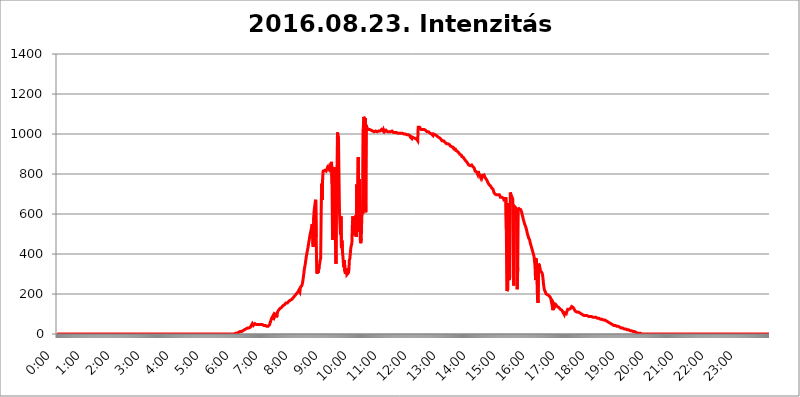
| Category | 2016.08.23. Intenzitás [W/m^2] |
|---|---|
| 0.0 | 0 |
| 0.0006944444444444445 | 0 |
| 0.001388888888888889 | 0 |
| 0.0020833333333333333 | 0 |
| 0.002777777777777778 | 0 |
| 0.003472222222222222 | 0 |
| 0.004166666666666667 | 0 |
| 0.004861111111111111 | 0 |
| 0.005555555555555556 | 0 |
| 0.0062499999999999995 | 0 |
| 0.006944444444444444 | 0 |
| 0.007638888888888889 | 0 |
| 0.008333333333333333 | 0 |
| 0.009027777777777779 | 0 |
| 0.009722222222222222 | 0 |
| 0.010416666666666666 | 0 |
| 0.011111111111111112 | 0 |
| 0.011805555555555555 | 0 |
| 0.012499999999999999 | 0 |
| 0.013194444444444444 | 0 |
| 0.013888888888888888 | 0 |
| 0.014583333333333332 | 0 |
| 0.015277777777777777 | 0 |
| 0.015972222222222224 | 0 |
| 0.016666666666666666 | 0 |
| 0.017361111111111112 | 0 |
| 0.018055555555555557 | 0 |
| 0.01875 | 0 |
| 0.019444444444444445 | 0 |
| 0.02013888888888889 | 0 |
| 0.020833333333333332 | 0 |
| 0.02152777777777778 | 0 |
| 0.022222222222222223 | 0 |
| 0.02291666666666667 | 0 |
| 0.02361111111111111 | 0 |
| 0.024305555555555556 | 0 |
| 0.024999999999999998 | 0 |
| 0.025694444444444447 | 0 |
| 0.02638888888888889 | 0 |
| 0.027083333333333334 | 0 |
| 0.027777777777777776 | 0 |
| 0.02847222222222222 | 0 |
| 0.029166666666666664 | 0 |
| 0.029861111111111113 | 0 |
| 0.030555555555555555 | 0 |
| 0.03125 | 0 |
| 0.03194444444444445 | 0 |
| 0.03263888888888889 | 0 |
| 0.03333333333333333 | 0 |
| 0.034027777777777775 | 0 |
| 0.034722222222222224 | 0 |
| 0.035416666666666666 | 0 |
| 0.036111111111111115 | 0 |
| 0.03680555555555556 | 0 |
| 0.0375 | 0 |
| 0.03819444444444444 | 0 |
| 0.03888888888888889 | 0 |
| 0.03958333333333333 | 0 |
| 0.04027777777777778 | 0 |
| 0.04097222222222222 | 0 |
| 0.041666666666666664 | 0 |
| 0.042361111111111106 | 0 |
| 0.04305555555555556 | 0 |
| 0.043750000000000004 | 0 |
| 0.044444444444444446 | 0 |
| 0.04513888888888889 | 0 |
| 0.04583333333333334 | 0 |
| 0.04652777777777778 | 0 |
| 0.04722222222222222 | 0 |
| 0.04791666666666666 | 0 |
| 0.04861111111111111 | 0 |
| 0.049305555555555554 | 0 |
| 0.049999999999999996 | 0 |
| 0.05069444444444445 | 0 |
| 0.051388888888888894 | 0 |
| 0.052083333333333336 | 0 |
| 0.05277777777777778 | 0 |
| 0.05347222222222222 | 0 |
| 0.05416666666666667 | 0 |
| 0.05486111111111111 | 0 |
| 0.05555555555555555 | 0 |
| 0.05625 | 0 |
| 0.05694444444444444 | 0 |
| 0.057638888888888885 | 0 |
| 0.05833333333333333 | 0 |
| 0.05902777777777778 | 0 |
| 0.059722222222222225 | 0 |
| 0.06041666666666667 | 0 |
| 0.061111111111111116 | 0 |
| 0.06180555555555556 | 0 |
| 0.0625 | 0 |
| 0.06319444444444444 | 0 |
| 0.06388888888888888 | 0 |
| 0.06458333333333334 | 0 |
| 0.06527777777777778 | 0 |
| 0.06597222222222222 | 0 |
| 0.06666666666666667 | 0 |
| 0.06736111111111111 | 0 |
| 0.06805555555555555 | 0 |
| 0.06874999999999999 | 0 |
| 0.06944444444444443 | 0 |
| 0.07013888888888889 | 0 |
| 0.07083333333333333 | 0 |
| 0.07152777777777779 | 0 |
| 0.07222222222222223 | 0 |
| 0.07291666666666667 | 0 |
| 0.07361111111111111 | 0 |
| 0.07430555555555556 | 0 |
| 0.075 | 0 |
| 0.07569444444444444 | 0 |
| 0.0763888888888889 | 0 |
| 0.07708333333333334 | 0 |
| 0.07777777777777778 | 0 |
| 0.07847222222222222 | 0 |
| 0.07916666666666666 | 0 |
| 0.0798611111111111 | 0 |
| 0.08055555555555556 | 0 |
| 0.08125 | 0 |
| 0.08194444444444444 | 0 |
| 0.08263888888888889 | 0 |
| 0.08333333333333333 | 0 |
| 0.08402777777777777 | 0 |
| 0.08472222222222221 | 0 |
| 0.08541666666666665 | 0 |
| 0.08611111111111112 | 0 |
| 0.08680555555555557 | 0 |
| 0.08750000000000001 | 0 |
| 0.08819444444444445 | 0 |
| 0.08888888888888889 | 0 |
| 0.08958333333333333 | 0 |
| 0.09027777777777778 | 0 |
| 0.09097222222222222 | 0 |
| 0.09166666666666667 | 0 |
| 0.09236111111111112 | 0 |
| 0.09305555555555556 | 0 |
| 0.09375 | 0 |
| 0.09444444444444444 | 0 |
| 0.09513888888888888 | 0 |
| 0.09583333333333333 | 0 |
| 0.09652777777777777 | 0 |
| 0.09722222222222222 | 0 |
| 0.09791666666666667 | 0 |
| 0.09861111111111111 | 0 |
| 0.09930555555555555 | 0 |
| 0.09999999999999999 | 0 |
| 0.10069444444444443 | 0 |
| 0.1013888888888889 | 0 |
| 0.10208333333333335 | 0 |
| 0.10277777777777779 | 0 |
| 0.10347222222222223 | 0 |
| 0.10416666666666667 | 0 |
| 0.10486111111111111 | 0 |
| 0.10555555555555556 | 0 |
| 0.10625 | 0 |
| 0.10694444444444444 | 0 |
| 0.1076388888888889 | 0 |
| 0.10833333333333334 | 0 |
| 0.10902777777777778 | 0 |
| 0.10972222222222222 | 0 |
| 0.1111111111111111 | 0 |
| 0.11180555555555556 | 0 |
| 0.11180555555555556 | 0 |
| 0.1125 | 0 |
| 0.11319444444444444 | 0 |
| 0.11388888888888889 | 0 |
| 0.11458333333333333 | 0 |
| 0.11527777777777777 | 0 |
| 0.11597222222222221 | 0 |
| 0.11666666666666665 | 0 |
| 0.1173611111111111 | 0 |
| 0.11805555555555557 | 0 |
| 0.11944444444444445 | 0 |
| 0.12013888888888889 | 0 |
| 0.12083333333333333 | 0 |
| 0.12152777777777778 | 0 |
| 0.12222222222222223 | 0 |
| 0.12291666666666667 | 0 |
| 0.12291666666666667 | 0 |
| 0.12361111111111112 | 0 |
| 0.12430555555555556 | 0 |
| 0.125 | 0 |
| 0.12569444444444444 | 0 |
| 0.12638888888888888 | 0 |
| 0.12708333333333333 | 0 |
| 0.16875 | 0 |
| 0.12847222222222224 | 0 |
| 0.12916666666666668 | 0 |
| 0.12986111111111112 | 0 |
| 0.13055555555555556 | 0 |
| 0.13125 | 0 |
| 0.13194444444444445 | 0 |
| 0.1326388888888889 | 0 |
| 0.13333333333333333 | 0 |
| 0.13402777777777777 | 0 |
| 0.13402777777777777 | 0 |
| 0.13472222222222222 | 0 |
| 0.13541666666666666 | 0 |
| 0.1361111111111111 | 0 |
| 0.13749999999999998 | 0 |
| 0.13819444444444443 | 0 |
| 0.1388888888888889 | 0 |
| 0.13958333333333334 | 0 |
| 0.14027777777777778 | 0 |
| 0.14097222222222222 | 0 |
| 0.14166666666666666 | 0 |
| 0.1423611111111111 | 0 |
| 0.14305555555555557 | 0 |
| 0.14375000000000002 | 0 |
| 0.14444444444444446 | 0 |
| 0.1451388888888889 | 0 |
| 0.1451388888888889 | 0 |
| 0.14652777777777778 | 0 |
| 0.14722222222222223 | 0 |
| 0.14791666666666667 | 0 |
| 0.1486111111111111 | 0 |
| 0.14930555555555555 | 0 |
| 0.15 | 0 |
| 0.15069444444444444 | 0 |
| 0.15138888888888888 | 0 |
| 0.15208333333333332 | 0 |
| 0.15277777777777776 | 0 |
| 0.15347222222222223 | 0 |
| 0.15416666666666667 | 0 |
| 0.15486111111111112 | 0 |
| 0.15555555555555556 | 0 |
| 0.15625 | 0 |
| 0.15694444444444444 | 0 |
| 0.15763888888888888 | 0 |
| 0.15833333333333333 | 0 |
| 0.15902777777777777 | 0 |
| 0.15972222222222224 | 0 |
| 0.16041666666666668 | 0 |
| 0.16111111111111112 | 0 |
| 0.16180555555555556 | 0 |
| 0.1625 | 0 |
| 0.16319444444444445 | 0 |
| 0.1638888888888889 | 0 |
| 0.16458333333333333 | 0 |
| 0.16527777777777777 | 0 |
| 0.16597222222222222 | 0 |
| 0.16666666666666666 | 0 |
| 0.1673611111111111 | 0 |
| 0.16805555555555554 | 0 |
| 0.16874999999999998 | 0 |
| 0.16944444444444443 | 0 |
| 0.17013888888888887 | 0 |
| 0.1708333333333333 | 0 |
| 0.17152777777777775 | 0 |
| 0.17222222222222225 | 0 |
| 0.1729166666666667 | 0 |
| 0.17361111111111113 | 0 |
| 0.17430555555555557 | 0 |
| 0.17500000000000002 | 0 |
| 0.17569444444444446 | 0 |
| 0.1763888888888889 | 0 |
| 0.17708333333333334 | 0 |
| 0.17777777777777778 | 0 |
| 0.17847222222222223 | 0 |
| 0.17916666666666667 | 0 |
| 0.1798611111111111 | 0 |
| 0.18055555555555555 | 0 |
| 0.18125 | 0 |
| 0.18194444444444444 | 0 |
| 0.1826388888888889 | 0 |
| 0.18333333333333335 | 0 |
| 0.1840277777777778 | 0 |
| 0.18472222222222223 | 0 |
| 0.18541666666666667 | 0 |
| 0.18611111111111112 | 0 |
| 0.18680555555555556 | 0 |
| 0.1875 | 0 |
| 0.18819444444444444 | 0 |
| 0.18888888888888888 | 0 |
| 0.18958333333333333 | 0 |
| 0.19027777777777777 | 0 |
| 0.1909722222222222 | 0 |
| 0.19166666666666665 | 0 |
| 0.19236111111111112 | 0 |
| 0.19305555555555554 | 0 |
| 0.19375 | 0 |
| 0.19444444444444445 | 0 |
| 0.1951388888888889 | 0 |
| 0.19583333333333333 | 0 |
| 0.19652777777777777 | 0 |
| 0.19722222222222222 | 0 |
| 0.19791666666666666 | 0 |
| 0.1986111111111111 | 0 |
| 0.19930555555555554 | 0 |
| 0.19999999999999998 | 0 |
| 0.20069444444444443 | 0 |
| 0.20138888888888887 | 0 |
| 0.2020833333333333 | 0 |
| 0.2027777777777778 | 0 |
| 0.2034722222222222 | 0 |
| 0.2041666666666667 | 0 |
| 0.20486111111111113 | 0 |
| 0.20555555555555557 | 0 |
| 0.20625000000000002 | 0 |
| 0.20694444444444446 | 0 |
| 0.2076388888888889 | 0 |
| 0.20833333333333334 | 0 |
| 0.20902777777777778 | 0 |
| 0.20972222222222223 | 0 |
| 0.21041666666666667 | 0 |
| 0.2111111111111111 | 0 |
| 0.21180555555555555 | 0 |
| 0.2125 | 0 |
| 0.21319444444444444 | 0 |
| 0.2138888888888889 | 0 |
| 0.21458333333333335 | 0 |
| 0.2152777777777778 | 0 |
| 0.21597222222222223 | 0 |
| 0.21666666666666667 | 0 |
| 0.21736111111111112 | 0 |
| 0.21805555555555556 | 0 |
| 0.21875 | 0 |
| 0.21944444444444444 | 0 |
| 0.22013888888888888 | 0 |
| 0.22083333333333333 | 0 |
| 0.22152777777777777 | 0 |
| 0.2222222222222222 | 0 |
| 0.22291666666666665 | 0 |
| 0.2236111111111111 | 0 |
| 0.22430555555555556 | 0 |
| 0.225 | 0 |
| 0.22569444444444445 | 0 |
| 0.2263888888888889 | 0 |
| 0.22708333333333333 | 0 |
| 0.22777777777777777 | 0 |
| 0.22847222222222222 | 0 |
| 0.22916666666666666 | 0 |
| 0.2298611111111111 | 0 |
| 0.23055555555555554 | 0 |
| 0.23124999999999998 | 0 |
| 0.23194444444444443 | 0 |
| 0.23263888888888887 | 0 |
| 0.2333333333333333 | 0 |
| 0.2340277777777778 | 0 |
| 0.2347222222222222 | 0 |
| 0.2354166666666667 | 0 |
| 0.23611111111111113 | 0 |
| 0.23680555555555557 | 0 |
| 0.23750000000000002 | 0 |
| 0.23819444444444446 | 0 |
| 0.2388888888888889 | 0 |
| 0.23958333333333334 | 0 |
| 0.24027777777777778 | 0 |
| 0.24097222222222223 | 0 |
| 0.24166666666666667 | 0 |
| 0.2423611111111111 | 0 |
| 0.24305555555555555 | 0 |
| 0.24375 | 0 |
| 0.24444444444444446 | 0 |
| 0.24513888888888888 | 0 |
| 0.24583333333333335 | 0 |
| 0.2465277777777778 | 0 |
| 0.24722222222222223 | 0 |
| 0.24791666666666667 | 0 |
| 0.24861111111111112 | 0 |
| 0.24930555555555556 | 0 |
| 0.25 | 3.525 |
| 0.25069444444444444 | 3.525 |
| 0.2513888888888889 | 3.525 |
| 0.2520833333333333 | 3.525 |
| 0.25277777777777777 | 3.525 |
| 0.2534722222222222 | 7.887 |
| 0.25416666666666665 | 7.887 |
| 0.2548611111111111 | 7.887 |
| 0.2555555555555556 | 12.257 |
| 0.25625000000000003 | 12.257 |
| 0.2569444444444445 | 12.257 |
| 0.2576388888888889 | 12.257 |
| 0.25833333333333336 | 12.257 |
| 0.2590277777777778 | 12.257 |
| 0.25972222222222224 | 16.636 |
| 0.2604166666666667 | 16.636 |
| 0.2611111111111111 | 21.024 |
| 0.26180555555555557 | 21.024 |
| 0.2625 | 21.024 |
| 0.26319444444444445 | 25.419 |
| 0.2638888888888889 | 25.419 |
| 0.26458333333333334 | 25.419 |
| 0.2652777777777778 | 29.823 |
| 0.2659722222222222 | 29.823 |
| 0.26666666666666666 | 29.823 |
| 0.2673611111111111 | 29.823 |
| 0.26805555555555555 | 29.823 |
| 0.26875 | 29.823 |
| 0.26944444444444443 | 29.823 |
| 0.2701388888888889 | 29.823 |
| 0.2708333333333333 | 34.234 |
| 0.27152777777777776 | 38.653 |
| 0.2722222222222222 | 43.079 |
| 0.27291666666666664 | 47.511 |
| 0.2736111111111111 | 51.951 |
| 0.2743055555555555 | 47.511 |
| 0.27499999999999997 | 43.079 |
| 0.27569444444444446 | 43.079 |
| 0.27638888888888885 | 43.079 |
| 0.27708333333333335 | 51.951 |
| 0.2777777777777778 | 56.398 |
| 0.27847222222222223 | 51.951 |
| 0.2791666666666667 | 47.511 |
| 0.2798611111111111 | 47.511 |
| 0.28055555555555556 | 47.511 |
| 0.28125 | 47.511 |
| 0.28194444444444444 | 47.511 |
| 0.2826388888888889 | 47.511 |
| 0.2833333333333333 | 47.511 |
| 0.28402777777777777 | 47.511 |
| 0.2847222222222222 | 47.511 |
| 0.28541666666666665 | 47.511 |
| 0.28611111111111115 | 47.511 |
| 0.28680555555555554 | 47.511 |
| 0.28750000000000003 | 47.511 |
| 0.2881944444444445 | 43.079 |
| 0.2888888888888889 | 43.079 |
| 0.28958333333333336 | 43.079 |
| 0.2902777777777778 | 43.079 |
| 0.29097222222222224 | 43.079 |
| 0.2916666666666667 | 43.079 |
| 0.2923611111111111 | 43.079 |
| 0.29305555555555557 | 43.079 |
| 0.29375 | 38.653 |
| 0.29444444444444445 | 38.653 |
| 0.2951388888888889 | 38.653 |
| 0.29583333333333334 | 38.653 |
| 0.2965277777777778 | 43.079 |
| 0.2972222222222222 | 43.079 |
| 0.29791666666666666 | 47.511 |
| 0.2986111111111111 | 56.398 |
| 0.29930555555555555 | 60.85 |
| 0.3 | 56.398 |
| 0.30069444444444443 | 78.722 |
| 0.3013888888888889 | 83.205 |
| 0.3020833333333333 | 87.692 |
| 0.30277777777777776 | 69.775 |
| 0.3034722222222222 | 65.31 |
| 0.30416666666666664 | 83.205 |
| 0.3048611111111111 | 101.184 |
| 0.3055555555555555 | 105.69 |
| 0.30624999999999997 | 105.69 |
| 0.3069444444444444 | 96.682 |
| 0.3076388888888889 | 83.205 |
| 0.30833333333333335 | 96.682 |
| 0.3090277777777778 | 110.201 |
| 0.30972222222222223 | 114.716 |
| 0.3104166666666667 | 119.235 |
| 0.3111111111111111 | 123.758 |
| 0.31180555555555556 | 123.758 |
| 0.3125 | 128.284 |
| 0.31319444444444444 | 128.284 |
| 0.3138888888888889 | 132.814 |
| 0.3145833333333333 | 132.814 |
| 0.31527777777777777 | 137.347 |
| 0.3159722222222222 | 137.347 |
| 0.31666666666666665 | 141.884 |
| 0.31736111111111115 | 141.884 |
| 0.31805555555555554 | 146.423 |
| 0.31875000000000003 | 146.423 |
| 0.3194444444444445 | 150.964 |
| 0.3201388888888889 | 150.964 |
| 0.32083333333333336 | 155.509 |
| 0.3215277777777778 | 155.509 |
| 0.32222222222222224 | 155.509 |
| 0.3229166666666667 | 155.509 |
| 0.3236111111111111 | 160.056 |
| 0.32430555555555557 | 160.056 |
| 0.325 | 164.605 |
| 0.32569444444444445 | 164.605 |
| 0.3263888888888889 | 164.605 |
| 0.32708333333333334 | 169.156 |
| 0.3277777777777778 | 169.156 |
| 0.3284722222222222 | 173.709 |
| 0.32916666666666666 | 173.709 |
| 0.3298611111111111 | 178.264 |
| 0.33055555555555555 | 178.264 |
| 0.33125 | 182.82 |
| 0.33194444444444443 | 182.82 |
| 0.3326388888888889 | 187.378 |
| 0.3333333333333333 | 191.937 |
| 0.3340277777777778 | 191.937 |
| 0.3347222222222222 | 196.497 |
| 0.3354166666666667 | 201.058 |
| 0.3361111111111111 | 205.62 |
| 0.3368055555555556 | 205.62 |
| 0.33749999999999997 | 210.182 |
| 0.33819444444444446 | 214.746 |
| 0.33888888888888885 | 219.309 |
| 0.33958333333333335 | 219.309 |
| 0.34027777777777773 | 210.182 |
| 0.34097222222222223 | 233 |
| 0.3416666666666666 | 233 |
| 0.3423611111111111 | 237.564 |
| 0.3430555555555555 | 242.127 |
| 0.34375 | 251.251 |
| 0.3444444444444445 | 264.932 |
| 0.3451388888888889 | 283.156 |
| 0.3458333333333334 | 301.354 |
| 0.34652777777777777 | 324.052 |
| 0.34722222222222227 | 337.639 |
| 0.34791666666666665 | 351.198 |
| 0.34861111111111115 | 369.23 |
| 0.34930555555555554 | 387.202 |
| 0.35000000000000003 | 400.638 |
| 0.3506944444444444 | 414.035 |
| 0.3513888888888889 | 427.39 |
| 0.3520833333333333 | 440.702 |
| 0.3527777777777778 | 458.38 |
| 0.3534722222222222 | 471.582 |
| 0.3541666666666667 | 489.108 |
| 0.3548611111111111 | 502.192 |
| 0.35555555555555557 | 506.542 |
| 0.35625 | 523.88 |
| 0.35694444444444445 | 523.88 |
| 0.3576388888888889 | 549.704 |
| 0.35833333333333334 | 549.704 |
| 0.3590277777777778 | 436.27 |
| 0.3597222222222222 | 583.779 |
| 0.36041666666666666 | 621.613 |
| 0.3611111111111111 | 638.256 |
| 0.36180555555555555 | 658.909 |
| 0.3625 | 671.22 |
| 0.36319444444444443 | 484.735 |
| 0.3638888888888889 | 310.44 |
| 0.3645833333333333 | 301.354 |
| 0.3652777777777778 | 324.052 |
| 0.3659722222222222 | 305.898 |
| 0.3666666666666667 | 305.898 |
| 0.3673611111111111 | 337.639 |
| 0.3680555555555556 | 351.198 |
| 0.36874999999999997 | 369.23 |
| 0.36944444444444446 | 378.224 |
| 0.37013888888888885 | 596.45 |
| 0.37083333333333335 | 751.803 |
| 0.37152777777777773 | 671.22 |
| 0.37222222222222223 | 775.492 |
| 0.3729166666666666 | 814.519 |
| 0.3736111111111111 | 814.519 |
| 0.3743055555555555 | 818.392 |
| 0.375 | 818.392 |
| 0.3756944444444445 | 818.392 |
| 0.3763888888888889 | 814.519 |
| 0.3770833333333334 | 814.519 |
| 0.37777777777777777 | 822.26 |
| 0.37847222222222227 | 826.123 |
| 0.37916666666666665 | 833.834 |
| 0.37986111111111115 | 829.981 |
| 0.38055555555555554 | 826.123 |
| 0.38125000000000003 | 833.834 |
| 0.3819444444444444 | 826.123 |
| 0.3826388888888889 | 826.123 |
| 0.3833333333333333 | 837.682 |
| 0.3840277777777778 | 849.199 |
| 0.3847222222222222 | 860.676 |
| 0.3854166666666667 | 751.803 |
| 0.3861111111111111 | 471.582 |
| 0.38680555555555557 | 683.473 |
| 0.3875 | 566.793 |
| 0.38819444444444445 | 833.834 |
| 0.3888888888888889 | 549.704 |
| 0.38958333333333334 | 779.42 |
| 0.3902777777777778 | 436.27 |
| 0.3909722222222222 | 351.198 |
| 0.39166666666666666 | 822.26 |
| 0.3923611111111111 | 625.784 |
| 0.39305555555555555 | 1007.383 |
| 0.39375 | 992.448 |
| 0.39444444444444443 | 984.98 |
| 0.3951388888888889 | 984.98 |
| 0.3958333333333333 | 609.062 |
| 0.3965277777777778 | 609.062 |
| 0.3972222222222222 | 497.836 |
| 0.3979166666666667 | 588.009 |
| 0.3986111111111111 | 431.833 |
| 0.3993055555555556 | 467.187 |
| 0.39999999999999997 | 414.035 |
| 0.40069444444444446 | 387.202 |
| 0.40138888888888885 | 351.198 |
| 0.40208333333333335 | 333.113 |
| 0.40277777777777773 | 369.23 |
| 0.40347222222222223 | 310.44 |
| 0.4041666666666666 | 301.354 |
| 0.4048611111111111 | 296.808 |
| 0.4055555555555555 | 328.584 |
| 0.40625 | 296.808 |
| 0.4069444444444445 | 296.808 |
| 0.4076388888888889 | 292.259 |
| 0.4083333333333334 | 305.898 |
| 0.40902777777777777 | 319.517 |
| 0.40972222222222227 | 369.23 |
| 0.41041666666666665 | 378.224 |
| 0.41111111111111115 | 405.108 |
| 0.41180555555555554 | 431.833 |
| 0.41250000000000003 | 436.27 |
| 0.4131944444444444 | 453.968 |
| 0.4138888888888889 | 541.121 |
| 0.4145833333333333 | 588.009 |
| 0.4152777777777778 | 562.53 |
| 0.4159722222222222 | 579.542 |
| 0.4166666666666667 | 493.475 |
| 0.4173611111111111 | 515.223 |
| 0.41805555555555557 | 545.416 |
| 0.41875 | 592.233 |
| 0.41944444444444445 | 484.735 |
| 0.4201388888888889 | 747.834 |
| 0.42083333333333334 | 510.885 |
| 0.4215277777777778 | 515.223 |
| 0.4222222222222222 | 883.516 |
| 0.42291666666666666 | 523.88 |
| 0.4236111111111111 | 775.492 |
| 0.42430555555555555 | 625.784 |
| 0.425 | 471.582 |
| 0.42569444444444443 | 453.968 |
| 0.4263888888888889 | 475.972 |
| 0.4270833333333333 | 579.542 |
| 0.4277777777777778 | 617.436 |
| 0.4284722222222222 | 600.661 |
| 0.4291666666666667 | 1022.323 |
| 0.4298611111111111 | 1086.097 |
| 0.4305555555555556 | 1078.555 |
| 0.43124999999999997 | 1022.323 |
| 0.43194444444444446 | 1078.555 |
| 0.43263888888888885 | 609.062 |
| 0.43333333333333335 | 1044.762 |
| 0.43402777777777773 | 1033.537 |
| 0.43472222222222223 | 1033.537 |
| 0.4354166666666666 | 1029.798 |
| 0.4361111111111111 | 1022.323 |
| 0.4368055555555555 | 1022.323 |
| 0.4375 | 1022.323 |
| 0.4381944444444445 | 1022.323 |
| 0.4388888888888889 | 1022.323 |
| 0.4395833333333334 | 1018.587 |
| 0.44027777777777777 | 1018.587 |
| 0.44097222222222227 | 1018.587 |
| 0.44166666666666665 | 1018.587 |
| 0.44236111111111115 | 1014.852 |
| 0.44305555555555554 | 1014.852 |
| 0.44375000000000003 | 1014.852 |
| 0.4444444444444444 | 1011.118 |
| 0.4451388888888889 | 1011.118 |
| 0.4458333333333333 | 1014.852 |
| 0.4465277777777778 | 1014.852 |
| 0.4472222222222222 | 1011.118 |
| 0.4479166666666667 | 1014.852 |
| 0.4486111111111111 | 1011.118 |
| 0.44930555555555557 | 1011.118 |
| 0.45 | 1011.118 |
| 0.45069444444444445 | 1014.852 |
| 0.4513888888888889 | 1014.852 |
| 0.45208333333333334 | 1014.852 |
| 0.4527777777777778 | 1014.852 |
| 0.4534722222222222 | 1014.852 |
| 0.45416666666666666 | 1014.852 |
| 0.4548611111111111 | 1022.323 |
| 0.45555555555555555 | 1018.587 |
| 0.45625 | 1018.587 |
| 0.45694444444444443 | 1014.852 |
| 0.4576388888888889 | 1022.323 |
| 0.4583333333333333 | 1018.587 |
| 0.4590277777777778 | 1011.118 |
| 0.4597222222222222 | 1014.852 |
| 0.4604166666666667 | 1014.852 |
| 0.4611111111111111 | 1018.587 |
| 0.4618055555555556 | 1014.852 |
| 0.46249999999999997 | 1014.852 |
| 0.46319444444444446 | 1011.118 |
| 0.46388888888888885 | 1011.118 |
| 0.46458333333333335 | 1014.852 |
| 0.46527777777777773 | 1011.118 |
| 0.46597222222222223 | 1011.118 |
| 0.4666666666666666 | 1011.118 |
| 0.4673611111111111 | 1011.118 |
| 0.4680555555555555 | 1011.118 |
| 0.46875 | 1011.118 |
| 0.4694444444444445 | 1014.852 |
| 0.4701388888888889 | 1011.118 |
| 0.4708333333333334 | 1011.118 |
| 0.47152777777777777 | 1007.383 |
| 0.47222222222222227 | 1007.383 |
| 0.47291666666666665 | 1007.383 |
| 0.47361111111111115 | 1007.383 |
| 0.47430555555555554 | 1007.383 |
| 0.47500000000000003 | 1007.383 |
| 0.4756944444444444 | 1007.383 |
| 0.4763888888888889 | 1007.383 |
| 0.4770833333333333 | 1003.65 |
| 0.4777777777777778 | 1003.65 |
| 0.4784722222222222 | 1003.65 |
| 0.4791666666666667 | 999.916 |
| 0.4798611111111111 | 1003.65 |
| 0.48055555555555557 | 1003.65 |
| 0.48125 | 1003.65 |
| 0.48194444444444445 | 1003.65 |
| 0.4826388888888889 | 1003.65 |
| 0.48333333333333334 | 1003.65 |
| 0.4840277777777778 | 1003.65 |
| 0.4847222222222222 | 1003.65 |
| 0.48541666666666666 | 999.916 |
| 0.4861111111111111 | 999.916 |
| 0.48680555555555555 | 999.916 |
| 0.4875 | 999.916 |
| 0.48819444444444443 | 999.916 |
| 0.4888888888888889 | 1003.65 |
| 0.4895833333333333 | 999.916 |
| 0.4902777777777778 | 996.182 |
| 0.4909722222222222 | 996.182 |
| 0.4916666666666667 | 996.182 |
| 0.4923611111111111 | 996.182 |
| 0.4930555555555556 | 992.448 |
| 0.49374999999999997 | 996.182 |
| 0.49444444444444446 | 992.448 |
| 0.49513888888888885 | 984.98 |
| 0.49583333333333335 | 984.98 |
| 0.49652777777777773 | 984.98 |
| 0.49722222222222223 | 977.508 |
| 0.4979166666666666 | 984.98 |
| 0.4986111111111111 | 984.98 |
| 0.4993055555555555 | 981.244 |
| 0.5 | 981.244 |
| 0.5006944444444444 | 981.244 |
| 0.5013888888888889 | 977.508 |
| 0.5020833333333333 | 977.508 |
| 0.5027777777777778 | 977.508 |
| 0.5034722222222222 | 977.508 |
| 0.5041666666666667 | 973.772 |
| 0.5048611111111111 | 970.034 |
| 0.5055555555555555 | 966.295 |
| 0.50625 | 1033.537 |
| 0.5069444444444444 | 1037.277 |
| 0.5076388888888889 | 1037.277 |
| 0.5083333333333333 | 1033.537 |
| 0.5090277777777777 | 1029.798 |
| 0.5097222222222222 | 1029.798 |
| 0.5104166666666666 | 1022.323 |
| 0.5111111111111112 | 1022.323 |
| 0.5118055555555555 | 1022.323 |
| 0.5125000000000001 | 1022.323 |
| 0.5131944444444444 | 1022.323 |
| 0.513888888888889 | 1022.323 |
| 0.5145833333333333 | 1022.323 |
| 0.5152777777777778 | 1018.587 |
| 0.5159722222222222 | 1022.323 |
| 0.5166666666666667 | 1018.587 |
| 0.517361111111111 | 1018.587 |
| 0.5180555555555556 | 1018.587 |
| 0.5187499999999999 | 1011.118 |
| 0.5194444444444445 | 1011.118 |
| 0.5201388888888888 | 1007.383 |
| 0.5208333333333334 | 1011.118 |
| 0.5215277777777778 | 1007.383 |
| 0.5222222222222223 | 1007.383 |
| 0.5229166666666667 | 1003.65 |
| 0.5236111111111111 | 999.916 |
| 0.5243055555555556 | 999.916 |
| 0.525 | 999.916 |
| 0.5256944444444445 | 996.182 |
| 0.5263888888888889 | 996.182 |
| 0.5270833333333333 | 992.448 |
| 0.5277777777777778 | 999.916 |
| 0.5284722222222222 | 996.182 |
| 0.5291666666666667 | 996.182 |
| 0.5298611111111111 | 996.182 |
| 0.5305555555555556 | 996.182 |
| 0.53125 | 992.448 |
| 0.5319444444444444 | 992.448 |
| 0.5326388888888889 | 988.714 |
| 0.5333333333333333 | 988.714 |
| 0.5340277777777778 | 984.98 |
| 0.5347222222222222 | 984.98 |
| 0.5354166666666667 | 981.244 |
| 0.5361111111111111 | 981.244 |
| 0.5368055555555555 | 977.508 |
| 0.5375 | 977.508 |
| 0.5381944444444444 | 973.772 |
| 0.5388888888888889 | 970.034 |
| 0.5395833333333333 | 966.295 |
| 0.5402777777777777 | 966.295 |
| 0.5409722222222222 | 966.295 |
| 0.5416666666666666 | 966.295 |
| 0.5423611111111112 | 962.555 |
| 0.5430555555555555 | 962.555 |
| 0.5437500000000001 | 958.814 |
| 0.5444444444444444 | 958.814 |
| 0.545138888888889 | 955.071 |
| 0.5458333333333333 | 951.327 |
| 0.5465277777777778 | 951.327 |
| 0.5472222222222222 | 951.327 |
| 0.5479166666666667 | 951.327 |
| 0.548611111111111 | 947.58 |
| 0.5493055555555556 | 947.58 |
| 0.5499999999999999 | 947.58 |
| 0.5506944444444445 | 943.832 |
| 0.5513888888888888 | 940.082 |
| 0.5520833333333334 | 940.082 |
| 0.5527777777777778 | 936.33 |
| 0.5534722222222223 | 936.33 |
| 0.5541666666666667 | 932.576 |
| 0.5548611111111111 | 932.576 |
| 0.5555555555555556 | 932.576 |
| 0.55625 | 925.06 |
| 0.5569444444444445 | 925.06 |
| 0.5576388888888889 | 925.06 |
| 0.5583333333333333 | 925.06 |
| 0.5590277777777778 | 917.534 |
| 0.5597222222222222 | 917.534 |
| 0.5604166666666667 | 917.534 |
| 0.5611111111111111 | 913.766 |
| 0.5618055555555556 | 913.766 |
| 0.5625 | 909.996 |
| 0.5631944444444444 | 906.223 |
| 0.5638888888888889 | 902.447 |
| 0.5645833333333333 | 898.668 |
| 0.5652777777777778 | 894.885 |
| 0.5659722222222222 | 894.885 |
| 0.5666666666666667 | 894.885 |
| 0.5673611111111111 | 887.309 |
| 0.5680555555555555 | 887.309 |
| 0.56875 | 887.309 |
| 0.5694444444444444 | 883.516 |
| 0.5701388888888889 | 879.719 |
| 0.5708333333333333 | 875.918 |
| 0.5715277777777777 | 872.114 |
| 0.5722222222222222 | 868.305 |
| 0.5729166666666666 | 868.305 |
| 0.5736111111111112 | 864.493 |
| 0.5743055555555555 | 860.676 |
| 0.5750000000000001 | 860.676 |
| 0.5756944444444444 | 853.029 |
| 0.576388888888889 | 853.029 |
| 0.5770833333333333 | 845.365 |
| 0.5777777777777778 | 841.526 |
| 0.5784722222222222 | 845.365 |
| 0.5791666666666667 | 841.526 |
| 0.579861111111111 | 841.526 |
| 0.5805555555555556 | 841.526 |
| 0.5812499999999999 | 845.365 |
| 0.5819444444444445 | 841.526 |
| 0.5826388888888888 | 837.682 |
| 0.5833333333333334 | 833.834 |
| 0.5840277777777778 | 833.834 |
| 0.5847222222222223 | 829.981 |
| 0.5854166666666667 | 822.26 |
| 0.5861111111111111 | 814.519 |
| 0.5868055555555556 | 818.392 |
| 0.5875 | 814.519 |
| 0.5881944444444445 | 810.641 |
| 0.5888888888888889 | 806.757 |
| 0.5895833333333333 | 798.974 |
| 0.5902777777777778 | 814.519 |
| 0.5909722222222222 | 806.757 |
| 0.5916666666666667 | 802.868 |
| 0.5923611111111111 | 795.074 |
| 0.5930555555555556 | 791.169 |
| 0.59375 | 783.342 |
| 0.5944444444444444 | 798.974 |
| 0.5951388888888889 | 795.074 |
| 0.5958333333333333 | 783.342 |
| 0.5965277777777778 | 791.169 |
| 0.5972222222222222 | 787.258 |
| 0.5979166666666667 | 791.169 |
| 0.5986111111111111 | 795.074 |
| 0.5993055555555555 | 795.074 |
| 0.6 | 783.342 |
| 0.6006944444444444 | 783.342 |
| 0.6013888888888889 | 775.492 |
| 0.6020833333333333 | 775.492 |
| 0.6027777777777777 | 767.62 |
| 0.6034722222222222 | 763.674 |
| 0.6041666666666666 | 755.766 |
| 0.6048611111111112 | 751.803 |
| 0.6055555555555555 | 747.834 |
| 0.6062500000000001 | 743.859 |
| 0.6069444444444444 | 743.859 |
| 0.607638888888889 | 739.877 |
| 0.6083333333333333 | 735.89 |
| 0.6090277777777778 | 731.896 |
| 0.6097222222222222 | 727.896 |
| 0.6104166666666667 | 727.896 |
| 0.611111111111111 | 723.889 |
| 0.6118055555555556 | 719.877 |
| 0.6124999999999999 | 707.8 |
| 0.6131944444444445 | 703.762 |
| 0.6138888888888888 | 699.717 |
| 0.6145833333333334 | 703.762 |
| 0.6152777777777778 | 703.762 |
| 0.6159722222222223 | 695.666 |
| 0.6166666666666667 | 695.666 |
| 0.6173611111111111 | 695.666 |
| 0.6180555555555556 | 695.666 |
| 0.61875 | 695.666 |
| 0.6194444444444445 | 695.666 |
| 0.6201388888888889 | 695.666 |
| 0.6208333333333333 | 695.666 |
| 0.6215277777777778 | 683.473 |
| 0.6222222222222222 | 683.473 |
| 0.6229166666666667 | 687.544 |
| 0.6236111111111111 | 683.473 |
| 0.6243055555555556 | 683.473 |
| 0.625 | 683.473 |
| 0.6256944444444444 | 679.395 |
| 0.6263888888888889 | 671.22 |
| 0.6270833333333333 | 667.123 |
| 0.6277777777777778 | 667.123 |
| 0.6284722222222222 | 675.311 |
| 0.6291666666666667 | 683.473 |
| 0.6298611111111111 | 523.88 |
| 0.6305555555555555 | 214.746 |
| 0.63125 | 214.746 |
| 0.6319444444444444 | 223.873 |
| 0.6326388888888889 | 654.791 |
| 0.6333333333333333 | 414.035 |
| 0.6340277777777777 | 269.49 |
| 0.6347222222222222 | 287.709 |
| 0.6354166666666666 | 707.8 |
| 0.6361111111111112 | 699.717 |
| 0.6368055555555555 | 695.666 |
| 0.6375000000000001 | 687.544 |
| 0.6381944444444444 | 683.473 |
| 0.638888888888889 | 675.311 |
| 0.6395833333333333 | 671.22 |
| 0.6402777777777778 | 242.127 |
| 0.6409722222222222 | 629.948 |
| 0.6416666666666667 | 566.793 |
| 0.642361111111111 | 634.105 |
| 0.6430555555555556 | 634.105 |
| 0.6437499999999999 | 629.948 |
| 0.6444444444444445 | 625.784 |
| 0.6451388888888888 | 223.873 |
| 0.6458333333333334 | 333.113 |
| 0.6465277777777778 | 629.948 |
| 0.6472222222222223 | 617.436 |
| 0.6479166666666667 | 625.784 |
| 0.6486111111111111 | 629.948 |
| 0.6493055555555556 | 625.784 |
| 0.65 | 621.613 |
| 0.6506944444444445 | 617.436 |
| 0.6513888888888889 | 609.062 |
| 0.6520833333333333 | 596.45 |
| 0.6527777777777778 | 588.009 |
| 0.6534722222222222 | 575.299 |
| 0.6541666666666667 | 571.049 |
| 0.6548611111111111 | 558.261 |
| 0.6555555555555556 | 549.704 |
| 0.65625 | 545.416 |
| 0.6569444444444444 | 536.82 |
| 0.6576388888888889 | 528.2 |
| 0.6583333333333333 | 519.555 |
| 0.6590277777777778 | 506.542 |
| 0.6597222222222222 | 497.836 |
| 0.6604166666666667 | 489.108 |
| 0.6611111111111111 | 480.356 |
| 0.6618055555555555 | 475.972 |
| 0.6625 | 471.582 |
| 0.6631944444444444 | 458.38 |
| 0.6638888888888889 | 449.551 |
| 0.6645833333333333 | 449.551 |
| 0.6652777777777777 | 431.833 |
| 0.6659722222222222 | 422.943 |
| 0.6666666666666666 | 414.035 |
| 0.6673611111111111 | 405.108 |
| 0.6680555555555556 | 396.164 |
| 0.6687500000000001 | 387.202 |
| 0.6694444444444444 | 387.202 |
| 0.6701388888888888 | 337.639 |
| 0.6708333333333334 | 269.49 |
| 0.6715277777777778 | 378.224 |
| 0.6722222222222222 | 351.198 |
| 0.6729166666666666 | 264.932 |
| 0.6736111111111112 | 173.709 |
| 0.6743055555555556 | 155.509 |
| 0.6749999999999999 | 351.198 |
| 0.6756944444444444 | 355.712 |
| 0.6763888888888889 | 342.162 |
| 0.6770833333333334 | 328.584 |
| 0.6777777777777777 | 314.98 |
| 0.6784722222222223 | 310.44 |
| 0.6791666666666667 | 310.44 |
| 0.6798611111111111 | 305.898 |
| 0.6805555555555555 | 296.808 |
| 0.68125 | 278.603 |
| 0.6819444444444445 | 251.251 |
| 0.6826388888888889 | 233 |
| 0.6833333333333332 | 219.309 |
| 0.6840277777777778 | 214.746 |
| 0.6847222222222222 | 210.182 |
| 0.6854166666666667 | 201.058 |
| 0.686111111111111 | 201.058 |
| 0.6868055555555556 | 201.058 |
| 0.6875 | 196.497 |
| 0.6881944444444444 | 191.937 |
| 0.688888888888889 | 196.497 |
| 0.6895833333333333 | 191.937 |
| 0.6902777777777778 | 191.937 |
| 0.6909722222222222 | 187.378 |
| 0.6916666666666668 | 182.82 |
| 0.6923611111111111 | 173.709 |
| 0.6930555555555555 | 173.709 |
| 0.69375 | 169.156 |
| 0.6944444444444445 | 137.347 |
| 0.6951388888888889 | 119.235 |
| 0.6958333333333333 | 155.509 |
| 0.6965277777777777 | 155.509 |
| 0.6972222222222223 | 146.423 |
| 0.6979166666666666 | 137.347 |
| 0.6986111111111111 | 137.347 |
| 0.6993055555555556 | 146.423 |
| 0.7000000000000001 | 146.423 |
| 0.7006944444444444 | 141.884 |
| 0.7013888888888888 | 137.347 |
| 0.7020833333333334 | 137.347 |
| 0.7027777777777778 | 137.347 |
| 0.7034722222222222 | 132.814 |
| 0.7041666666666666 | 132.814 |
| 0.7048611111111112 | 128.284 |
| 0.7055555555555556 | 123.758 |
| 0.7062499999999999 | 123.758 |
| 0.7069444444444444 | 123.758 |
| 0.7076388888888889 | 119.235 |
| 0.7083333333333334 | 119.235 |
| 0.7090277777777777 | 110.201 |
| 0.7097222222222223 | 110.201 |
| 0.7104166666666667 | 105.69 |
| 0.7111111111111111 | 96.682 |
| 0.7118055555555555 | 105.69 |
| 0.7125 | 105.69 |
| 0.7131944444444445 | 101.184 |
| 0.7138888888888889 | 101.184 |
| 0.7145833333333332 | 101.184 |
| 0.7152777777777778 | 101.184 |
| 0.7159722222222222 | 123.758 |
| 0.7166666666666667 | 119.235 |
| 0.717361111111111 | 123.758 |
| 0.7180555555555556 | 123.758 |
| 0.71875 | 123.758 |
| 0.7194444444444444 | 123.758 |
| 0.720138888888889 | 128.284 |
| 0.7208333333333333 | 132.814 |
| 0.7215277777777778 | 137.347 |
| 0.7222222222222222 | 141.884 |
| 0.7229166666666668 | 137.347 |
| 0.7236111111111111 | 132.814 |
| 0.7243055555555555 | 128.284 |
| 0.725 | 123.758 |
| 0.7256944444444445 | 119.235 |
| 0.7263888888888889 | 114.716 |
| 0.7270833333333333 | 114.716 |
| 0.7277777777777777 | 114.716 |
| 0.7284722222222223 | 110.201 |
| 0.7291666666666666 | 110.201 |
| 0.7298611111111111 | 110.201 |
| 0.7305555555555556 | 110.201 |
| 0.7312500000000001 | 105.69 |
| 0.7319444444444444 | 105.69 |
| 0.7326388888888888 | 105.69 |
| 0.7333333333333334 | 105.69 |
| 0.7340277777777778 | 101.184 |
| 0.7347222222222222 | 101.184 |
| 0.7354166666666666 | 101.184 |
| 0.7361111111111112 | 101.184 |
| 0.7368055555555556 | 96.682 |
| 0.7374999999999999 | 96.682 |
| 0.7381944444444444 | 92.184 |
| 0.7388888888888889 | 92.184 |
| 0.7395833333333334 | 92.184 |
| 0.7402777777777777 | 92.184 |
| 0.7409722222222223 | 92.184 |
| 0.7416666666666667 | 92.184 |
| 0.7423611111111111 | 92.184 |
| 0.7430555555555555 | 92.184 |
| 0.74375 | 92.184 |
| 0.7444444444444445 | 92.184 |
| 0.7451388888888889 | 87.692 |
| 0.7458333333333332 | 87.692 |
| 0.7465277777777778 | 87.692 |
| 0.7472222222222222 | 87.692 |
| 0.7479166666666667 | 87.692 |
| 0.748611111111111 | 87.692 |
| 0.7493055555555556 | 87.692 |
| 0.75 | 83.205 |
| 0.7506944444444444 | 83.205 |
| 0.751388888888889 | 83.205 |
| 0.7520833333333333 | 83.205 |
| 0.7527777777777778 | 83.205 |
| 0.7534722222222222 | 83.205 |
| 0.7541666666666668 | 83.205 |
| 0.7548611111111111 | 83.205 |
| 0.7555555555555555 | 83.205 |
| 0.75625 | 78.722 |
| 0.7569444444444445 | 78.722 |
| 0.7576388888888889 | 78.722 |
| 0.7583333333333333 | 78.722 |
| 0.7590277777777777 | 78.722 |
| 0.7597222222222223 | 78.722 |
| 0.7604166666666666 | 78.722 |
| 0.7611111111111111 | 78.722 |
| 0.7618055555555556 | 74.246 |
| 0.7625000000000001 | 74.246 |
| 0.7631944444444444 | 74.246 |
| 0.7638888888888888 | 74.246 |
| 0.7645833333333334 | 74.246 |
| 0.7652777777777778 | 74.246 |
| 0.7659722222222222 | 69.775 |
| 0.7666666666666666 | 69.775 |
| 0.7673611111111112 | 69.775 |
| 0.7680555555555556 | 69.775 |
| 0.7687499999999999 | 65.31 |
| 0.7694444444444444 | 65.31 |
| 0.7701388888888889 | 65.31 |
| 0.7708333333333334 | 60.85 |
| 0.7715277777777777 | 60.85 |
| 0.7722222222222223 | 60.85 |
| 0.7729166666666667 | 60.85 |
| 0.7736111111111111 | 56.398 |
| 0.7743055555555555 | 56.398 |
| 0.775 | 56.398 |
| 0.7756944444444445 | 56.398 |
| 0.7763888888888889 | 51.951 |
| 0.7770833333333332 | 51.951 |
| 0.7777777777777778 | 47.511 |
| 0.7784722222222222 | 47.511 |
| 0.7791666666666667 | 47.511 |
| 0.779861111111111 | 47.511 |
| 0.7805555555555556 | 43.079 |
| 0.78125 | 43.079 |
| 0.7819444444444444 | 43.079 |
| 0.782638888888889 | 43.079 |
| 0.7833333333333333 | 38.653 |
| 0.7840277777777778 | 38.653 |
| 0.7847222222222222 | 38.653 |
| 0.7854166666666668 | 38.653 |
| 0.7861111111111111 | 38.653 |
| 0.7868055555555555 | 38.653 |
| 0.7875 | 34.234 |
| 0.7881944444444445 | 34.234 |
| 0.7888888888888889 | 34.234 |
| 0.7895833333333333 | 34.234 |
| 0.7902777777777777 | 34.234 |
| 0.7909722222222223 | 29.823 |
| 0.7916666666666666 | 29.823 |
| 0.7923611111111111 | 29.823 |
| 0.7930555555555556 | 29.823 |
| 0.7937500000000001 | 29.823 |
| 0.7944444444444444 | 25.419 |
| 0.7951388888888888 | 25.419 |
| 0.7958333333333334 | 25.419 |
| 0.7965277777777778 | 25.419 |
| 0.7972222222222222 | 25.419 |
| 0.7979166666666666 | 21.024 |
| 0.7986111111111112 | 21.024 |
| 0.7993055555555556 | 21.024 |
| 0.7999999999999999 | 21.024 |
| 0.8006944444444444 | 21.024 |
| 0.8013888888888889 | 21.024 |
| 0.8020833333333334 | 21.024 |
| 0.8027777777777777 | 16.636 |
| 0.8034722222222223 | 16.636 |
| 0.8041666666666667 | 16.636 |
| 0.8048611111111111 | 16.636 |
| 0.8055555555555555 | 16.636 |
| 0.80625 | 12.257 |
| 0.8069444444444445 | 12.257 |
| 0.8076388888888889 | 12.257 |
| 0.8083333333333332 | 12.257 |
| 0.8090277777777778 | 12.257 |
| 0.8097222222222222 | 12.257 |
| 0.8104166666666667 | 7.887 |
| 0.811111111111111 | 7.887 |
| 0.8118055555555556 | 7.887 |
| 0.8125 | 7.887 |
| 0.8131944444444444 | 7.887 |
| 0.813888888888889 | 3.525 |
| 0.8145833333333333 | 3.525 |
| 0.8152777777777778 | 3.525 |
| 0.8159722222222222 | 3.525 |
| 0.8166666666666668 | 3.525 |
| 0.8173611111111111 | 3.525 |
| 0.8180555555555555 | 3.525 |
| 0.81875 | 3.525 |
| 0.8194444444444445 | 0 |
| 0.8201388888888889 | 0 |
| 0.8208333333333333 | 0 |
| 0.8215277777777777 | 0 |
| 0.8222222222222223 | 0 |
| 0.8229166666666666 | 0 |
| 0.8236111111111111 | 0 |
| 0.8243055555555556 | 0 |
| 0.8250000000000001 | 0 |
| 0.8256944444444444 | 0 |
| 0.8263888888888888 | 0 |
| 0.8270833333333334 | 0 |
| 0.8277777777777778 | 0 |
| 0.8284722222222222 | 0 |
| 0.8291666666666666 | 0 |
| 0.8298611111111112 | 0 |
| 0.8305555555555556 | 0 |
| 0.8312499999999999 | 0 |
| 0.8319444444444444 | 0 |
| 0.8326388888888889 | 0 |
| 0.8333333333333334 | 0 |
| 0.8340277777777777 | 0 |
| 0.8347222222222223 | 0 |
| 0.8354166666666667 | 0 |
| 0.8361111111111111 | 0 |
| 0.8368055555555555 | 0 |
| 0.8375 | 0 |
| 0.8381944444444445 | 0 |
| 0.8388888888888889 | 0 |
| 0.8395833333333332 | 0 |
| 0.8402777777777778 | 0 |
| 0.8409722222222222 | 0 |
| 0.8416666666666667 | 0 |
| 0.842361111111111 | 0 |
| 0.8430555555555556 | 0 |
| 0.84375 | 0 |
| 0.8444444444444444 | 0 |
| 0.845138888888889 | 0 |
| 0.8458333333333333 | 0 |
| 0.8465277777777778 | 0 |
| 0.8472222222222222 | 0 |
| 0.8479166666666668 | 0 |
| 0.8486111111111111 | 0 |
| 0.8493055555555555 | 0 |
| 0.85 | 0 |
| 0.8506944444444445 | 0 |
| 0.8513888888888889 | 0 |
| 0.8520833333333333 | 0 |
| 0.8527777777777777 | 0 |
| 0.8534722222222223 | 0 |
| 0.8541666666666666 | 0 |
| 0.8548611111111111 | 0 |
| 0.8555555555555556 | 0 |
| 0.8562500000000001 | 0 |
| 0.8569444444444444 | 0 |
| 0.8576388888888888 | 0 |
| 0.8583333333333334 | 0 |
| 0.8590277777777778 | 0 |
| 0.8597222222222222 | 0 |
| 0.8604166666666666 | 0 |
| 0.8611111111111112 | 0 |
| 0.8618055555555556 | 0 |
| 0.8624999999999999 | 0 |
| 0.8631944444444444 | 0 |
| 0.8638888888888889 | 0 |
| 0.8645833333333334 | 0 |
| 0.8652777777777777 | 0 |
| 0.8659722222222223 | 0 |
| 0.8666666666666667 | 0 |
| 0.8673611111111111 | 0 |
| 0.8680555555555555 | 0 |
| 0.86875 | 0 |
| 0.8694444444444445 | 0 |
| 0.8701388888888889 | 0 |
| 0.8708333333333332 | 0 |
| 0.8715277777777778 | 0 |
| 0.8722222222222222 | 0 |
| 0.8729166666666667 | 0 |
| 0.873611111111111 | 0 |
| 0.8743055555555556 | 0 |
| 0.875 | 0 |
| 0.8756944444444444 | 0 |
| 0.876388888888889 | 0 |
| 0.8770833333333333 | 0 |
| 0.8777777777777778 | 0 |
| 0.8784722222222222 | 0 |
| 0.8791666666666668 | 0 |
| 0.8798611111111111 | 0 |
| 0.8805555555555555 | 0 |
| 0.88125 | 0 |
| 0.8819444444444445 | 0 |
| 0.8826388888888889 | 0 |
| 0.8833333333333333 | 0 |
| 0.8840277777777777 | 0 |
| 0.8847222222222223 | 0 |
| 0.8854166666666666 | 0 |
| 0.8861111111111111 | 0 |
| 0.8868055555555556 | 0 |
| 0.8875000000000001 | 0 |
| 0.8881944444444444 | 0 |
| 0.8888888888888888 | 0 |
| 0.8895833333333334 | 0 |
| 0.8902777777777778 | 0 |
| 0.8909722222222222 | 0 |
| 0.8916666666666666 | 0 |
| 0.8923611111111112 | 0 |
| 0.8930555555555556 | 0 |
| 0.8937499999999999 | 0 |
| 0.8944444444444444 | 0 |
| 0.8951388888888889 | 0 |
| 0.8958333333333334 | 0 |
| 0.8965277777777777 | 0 |
| 0.8972222222222223 | 0 |
| 0.8979166666666667 | 0 |
| 0.8986111111111111 | 0 |
| 0.8993055555555555 | 0 |
| 0.9 | 0 |
| 0.9006944444444445 | 0 |
| 0.9013888888888889 | 0 |
| 0.9020833333333332 | 0 |
| 0.9027777777777778 | 0 |
| 0.9034722222222222 | 0 |
| 0.9041666666666667 | 0 |
| 0.904861111111111 | 0 |
| 0.9055555555555556 | 0 |
| 0.90625 | 0 |
| 0.9069444444444444 | 0 |
| 0.907638888888889 | 0 |
| 0.9083333333333333 | 0 |
| 0.9090277777777778 | 0 |
| 0.9097222222222222 | 0 |
| 0.9104166666666668 | 0 |
| 0.9111111111111111 | 0 |
| 0.9118055555555555 | 0 |
| 0.9125 | 0 |
| 0.9131944444444445 | 0 |
| 0.9138888888888889 | 0 |
| 0.9145833333333333 | 0 |
| 0.9152777777777777 | 0 |
| 0.9159722222222223 | 0 |
| 0.9166666666666666 | 0 |
| 0.9173611111111111 | 0 |
| 0.9180555555555556 | 0 |
| 0.9187500000000001 | 0 |
| 0.9194444444444444 | 0 |
| 0.9201388888888888 | 0 |
| 0.9208333333333334 | 0 |
| 0.9215277777777778 | 0 |
| 0.9222222222222222 | 0 |
| 0.9229166666666666 | 0 |
| 0.9236111111111112 | 0 |
| 0.9243055555555556 | 0 |
| 0.9249999999999999 | 0 |
| 0.9256944444444444 | 0 |
| 0.9263888888888889 | 0 |
| 0.9270833333333334 | 0 |
| 0.9277777777777777 | 0 |
| 0.9284722222222223 | 0 |
| 0.9291666666666667 | 0 |
| 0.9298611111111111 | 0 |
| 0.9305555555555555 | 0 |
| 0.93125 | 0 |
| 0.9319444444444445 | 0 |
| 0.9326388888888889 | 0 |
| 0.9333333333333332 | 0 |
| 0.9340277777777778 | 0 |
| 0.9347222222222222 | 0 |
| 0.9354166666666667 | 0 |
| 0.936111111111111 | 0 |
| 0.9368055555555556 | 0 |
| 0.9375 | 0 |
| 0.9381944444444444 | 0 |
| 0.938888888888889 | 0 |
| 0.9395833333333333 | 0 |
| 0.9402777777777778 | 0 |
| 0.9409722222222222 | 0 |
| 0.9416666666666668 | 0 |
| 0.9423611111111111 | 0 |
| 0.9430555555555555 | 0 |
| 0.94375 | 0 |
| 0.9444444444444445 | 0 |
| 0.9451388888888889 | 0 |
| 0.9458333333333333 | 0 |
| 0.9465277777777777 | 0 |
| 0.9472222222222223 | 0 |
| 0.9479166666666666 | 0 |
| 0.9486111111111111 | 0 |
| 0.9493055555555556 | 0 |
| 0.9500000000000001 | 0 |
| 0.9506944444444444 | 0 |
| 0.9513888888888888 | 0 |
| 0.9520833333333334 | 0 |
| 0.9527777777777778 | 0 |
| 0.9534722222222222 | 0 |
| 0.9541666666666666 | 0 |
| 0.9548611111111112 | 0 |
| 0.9555555555555556 | 0 |
| 0.9562499999999999 | 0 |
| 0.9569444444444444 | 0 |
| 0.9576388888888889 | 0 |
| 0.9583333333333334 | 0 |
| 0.9590277777777777 | 0 |
| 0.9597222222222223 | 0 |
| 0.9604166666666667 | 0 |
| 0.9611111111111111 | 0 |
| 0.9618055555555555 | 0 |
| 0.9625 | 0 |
| 0.9631944444444445 | 0 |
| 0.9638888888888889 | 0 |
| 0.9645833333333332 | 0 |
| 0.9652777777777778 | 0 |
| 0.9659722222222222 | 0 |
| 0.9666666666666667 | 0 |
| 0.967361111111111 | 0 |
| 0.9680555555555556 | 0 |
| 0.96875 | 0 |
| 0.9694444444444444 | 0 |
| 0.970138888888889 | 0 |
| 0.9708333333333333 | 0 |
| 0.9715277777777778 | 0 |
| 0.9722222222222222 | 0 |
| 0.9729166666666668 | 0 |
| 0.9736111111111111 | 0 |
| 0.9743055555555555 | 0 |
| 0.975 | 0 |
| 0.9756944444444445 | 0 |
| 0.9763888888888889 | 0 |
| 0.9770833333333333 | 0 |
| 0.9777777777777777 | 0 |
| 0.9784722222222223 | 0 |
| 0.9791666666666666 | 0 |
| 0.9798611111111111 | 0 |
| 0.9805555555555556 | 0 |
| 0.9812500000000001 | 0 |
| 0.9819444444444444 | 0 |
| 0.9826388888888888 | 0 |
| 0.9833333333333334 | 0 |
| 0.9840277777777778 | 0 |
| 0.9847222222222222 | 0 |
| 0.9854166666666666 | 0 |
| 0.9861111111111112 | 0 |
| 0.9868055555555556 | 0 |
| 0.9874999999999999 | 0 |
| 0.9881944444444444 | 0 |
| 0.9888888888888889 | 0 |
| 0.9895833333333334 | 0 |
| 0.9902777777777777 | 0 |
| 0.9909722222222223 | 0 |
| 0.9916666666666667 | 0 |
| 0.9923611111111111 | 0 |
| 0.9930555555555555 | 0 |
| 0.99375 | 0 |
| 0.9944444444444445 | 0 |
| 0.9951388888888889 | 0 |
| 0.9958333333333332 | 0 |
| 0.9965277777777778 | 0 |
| 0.9972222222222222 | 0 |
| 0.9979166666666667 | 0 |
| 0.998611111111111 | 0 |
| 0.9993055555555556 | 0 |